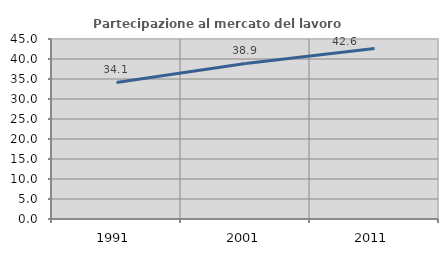
| Category | Partecipazione al mercato del lavoro  femminile |
|---|---|
| 1991.0 | 34.137 |
| 2001.0 | 38.889 |
| 2011.0 | 42.642 |